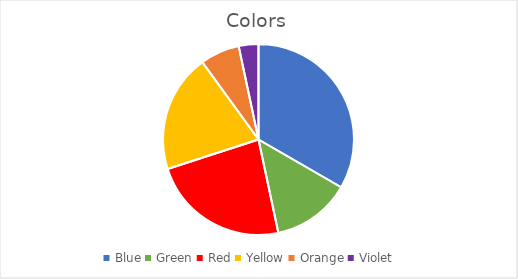
| Category | Series 0 |
|---|---|
| Blue | 10 |
| Green | 4 |
| Red | 7 |
| Yellow | 6 |
| Orange | 2 |
| Violet | 1 |